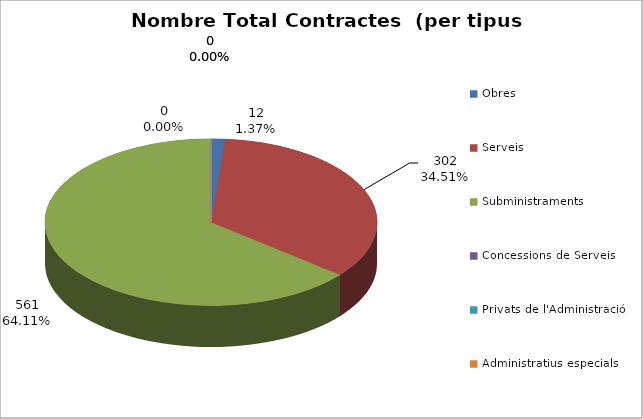
| Category | Nombre Total Contractes |
|---|---|
| Obres | 12 |
| Serveis | 302 |
| Subministraments | 561 |
| Concessions de Serveis | 0 |
| Privats de l'Administració | 0 |
| Administratius especials | 0 |